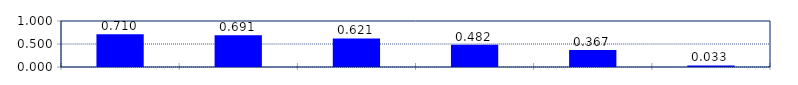
| Category | Series 0 |
|---|---|
| 0 | 0.71 |
| 1 | 0.691 |
| 2 | 0.621 |
| 3 | 0.482 |
| 4 | 0.367 |
| 5 | 0.033 |